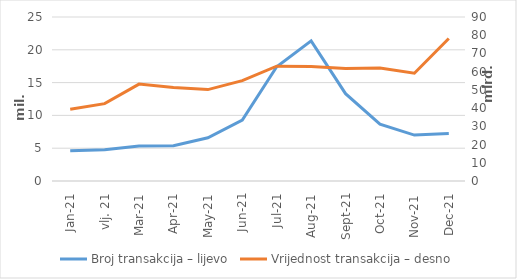
| Category | Broj transakcija – lijevo |
|---|---|
| sij.21 | 4617131 |
| vlj. 21 | 4751386 |
| ožu.21 | 5323427 |
| tra.21 | 5374273 |
| svi.21 | 6587230 |
| lip.21 | 9294530 |
| srp.21 | 17415444 |
| kol.21 | 21363200 |
| ruj.21 | 13317432 |
| lis.21 | 8673600 |
| stu.21 | 7000033 |
| pro.21 | 7232264 |